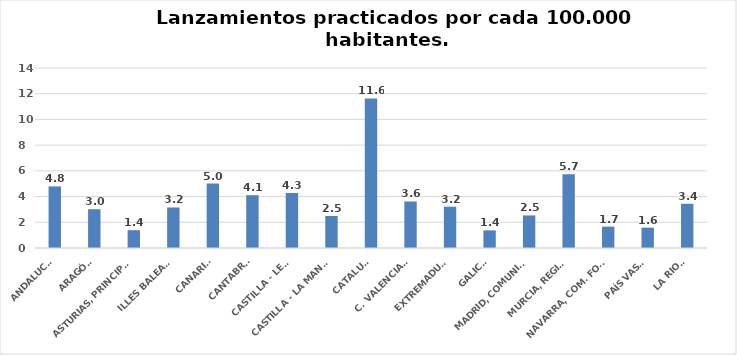
| Category | Series 0 |
|---|---|
| ANDALUCÍA | 4.79 |
| ARAGÓN | 3.016 |
| ASTURIAS, PRINCIPADO | 1.384 |
| ILLES BALEARS | 3.154 |
| CANARIAS | 5.016 |
| CANTABRIA | 4.106 |
| CASTILLA - LEÓN | 4.28 |
| CASTILLA - LA MANCHA | 2.488 |
| CATALUÑA | 11.632 |
| C. VALENCIANA | 3.618 |
| EXTREMADURA | 3.209 |
| GALICIA | 1.373 |
| MADRID, COMUNIDAD | 2.533 |
| MURCIA, REGIÓN | 5.729 |
| NAVARRA, COM. FORAL | 1.663 |
| PAÍS VASCO | 1.581 |
| LA RIOJA | 3.44 |